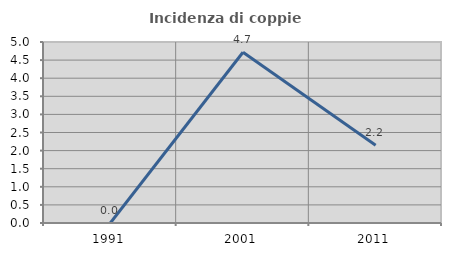
| Category | Incidenza di coppie miste |
|---|---|
| 1991.0 | 0 |
| 2001.0 | 4.717 |
| 2011.0 | 2.151 |